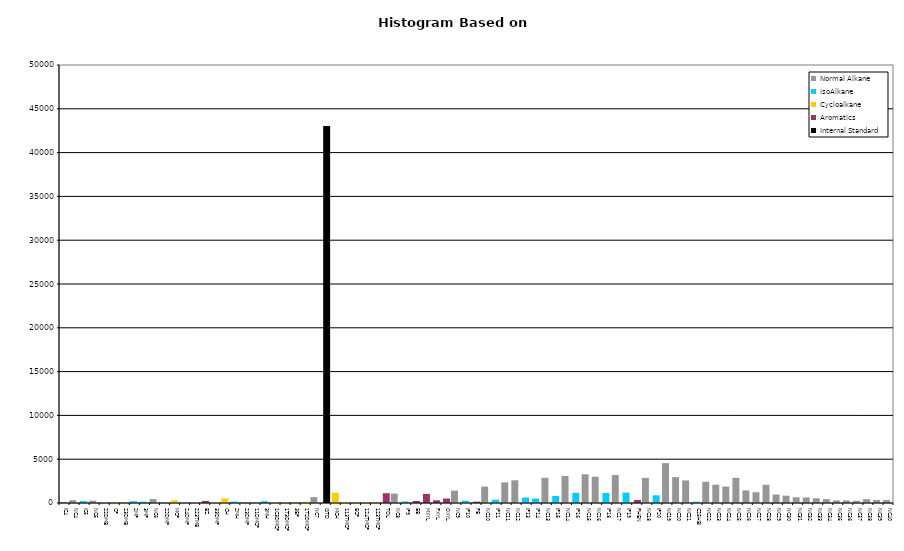
| Category | Normal Alkane | IsoAlkane | Cycloalkane | Aromatics | Internal Standard |
|---|---|---|---|---|---|
| IC4 | 0 | 106 | 0 | 0 | 0 |
| NC4 | 320 | 0 | 0 | 0 | 0 |
| IC5 | 0 | 215 | 0 | 0 | 0 |
| NC5 | 267 | 0 | 0 | 0 | 0 |
| 22DMB | 0 | 0 | 0 | 0 | 0 |
| CP | 0 | 0 | 69 | 0 | 0 |
| 23DMB | 0 | 27 | 0 | 0 | 0 |
| 2MP | 0 | 205 | 0 | 0 | 0 |
| 3MP | 0 | 142 | 0 | 0 | 0 |
| NC6 | 452 | 0 | 0 | 0 | 0 |
| 22DMP | 0 | 22 | 0 | 0 | 0 |
| MCP | 0 | 0 | 301 | 0 | 0 |
| 24DMP | 0 | 30 | 0 | 0 | 0 |
| 223TMB | 0 | 0 | 0 | 0 | 0 |
| BZ | 0 | 0 | 0 | 239 | 0 |
| 33DMP | 0 | 0 | 0 | 0 | 0 |
| CH | 0 | 0 | 528 | 0 | 0 |
| 2MH | 0 | 161 | 0 | 0 | 0 |
| 23DMP | 0 | 54 | 0 | 0 | 0 |
| 11DMCP | 0 | 0 | 54 | 0 | 0 |
| 3MH | 0 | 212 | 0 | 0 | 0 |
| 1C3DMCP | 0 | 0 | 97 | 0 | 0 |
| 1T3DMCP | 0 | 0 | 100 | 0 | 0 |
| 3EP | 0 | 15 | 0 | 0 | 0 |
| 1T2DMCP | 0 | 0 | 144 | 0 | 0 |
| NC7 | 674 | 0 | 0 | 0 | 0 |
| ISTD | 0 | 0 | 0 | 0 | 43023 |
| MCH | 0 | 0 | 1180 | 0 | 0 |
| 113TMCP | 0 | 0 | 75 | 0 | 0 |
| ECP | 0 | 0 | 71 | 0 | 0 |
| 124TMCP | 0 | 0 | 90 | 0 | 0 |
| 123TMCP | 0 | 0 | 70 | 0 | 0 |
| TOL | 0 | 0 | 0 | 1115 | 0 |
| NC8 | 1070 | 0 | 0 | 0 | 0 |
| IP9 | 0 | 178 | 0 | 0 | 0 |
| EB | 0 | 0 | 0 | 226 | 0 |
| MXYL | 0 | 0 | 0 | 1042 | 0 |
| PXYL | 0 | 0 | 0 | 313 | 0 |
| OXYL | 0 | 0 | 0 | 511 | 0 |
| NC9 | 1413 | 0 | 0 | 0 | 0 |
| IP10 | 0 | 261 | 0 | 0 | 0 |
| PB | 0 | 0 | 0 | 157 | 0 |
| NC10 | 1872 | 0 | 0 | 0 | 0 |
| IP11 | 0 | 383 | 0 | 0 | 0 |
| NC11 | 2359 | 0 | 0 | 0 | 0 |
| NC12 | 2594 | 0 | 0 | 0 | 0 |
| IP13 | 0 | 620 | 0 | 0 | 0 |
| IP14 | 0 | 517 | 0 | 0 | 0 |
| NC13 | 2883 | 0 | 0 | 0 | 0 |
| IP15 | 0 | 802 | 0 | 0 | 0 |
| NC14 | 3092 | 0 | 0 | 0 | 0 |
| IP16 | 0 | 1161 | 0 | 0 | 0 |
| NC15 | 3276 | 0 | 0 | 0 | 0 |
| NC16 | 2995 | 0 | 0 | 0 | 0 |
| IP18 | 0 | 1144 | 0 | 0 | 0 |
| NC17 | 3193 | 0 | 0 | 0 | 0 |
| IP19 | 0 | 1189 | 0 | 0 | 0 |
| PHEN | 0 | 0 | 0 | 350 | 0 |
| NC18 | 2865 | 0 | 0 | 0 | 0 |
| IP20 | 0 | 878 | 0 | 0 | 0 |
| NC19 | 4552 | 0 | 0 | 0 | 0 |
| NC20 | 2950 | 0 | 0 | 0 | 0 |
| NC21 | 2578 | 0 | 0 | 0 | 0 |
| C25HBI | 0 | 149 | 0 | 0 | 0 |
| NC22 | 2423 | 0 | 0 | 0 | 0 |
| NC23 | 2090 | 0 | 0 | 0 | 0 |
| NC24 | 1880 | 0 | 0 | 0 | 0 |
| NC25 | 2873 | 0 | 0 | 0 | 0 |
| NC26 | 1433 | 0 | 0 | 0 | 0 |
| NC27 | 1229 | 0 | 0 | 0 | 0 |
| NC28 | 2078 | 0 | 0 | 0 | 0 |
| NC29 | 963 | 0 | 0 | 0 | 0 |
| NC30 | 837 | 0 | 0 | 0 | 0 |
| NC31 | 650 | 0 | 0 | 0 | 0 |
| NC32 | 633 | 0 | 0 | 0 | 0 |
| NC33 | 542 | 0 | 0 | 0 | 0 |
| NC34 | 450 | 0 | 0 | 0 | 0 |
| NC35 | 293 | 0 | 0 | 0 | 0 |
| NC36 | 296 | 0 | 0 | 0 | 0 |
| NC37 | 251 | 0 | 0 | 0 | 0 |
| NC38 | 434 | 0 | 0 | 0 | 0 |
| NC39 | 351 | 0 | 0 | 0 | 0 |
| NC40 | 337 | 0 | 0 | 0 | 0 |